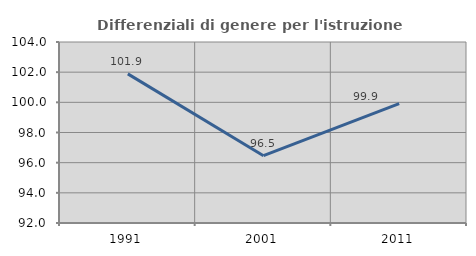
| Category | Differenziali di genere per l'istruzione superiore |
|---|---|
| 1991.0 | 101.888 |
| 2001.0 | 96.461 |
| 2011.0 | 99.912 |